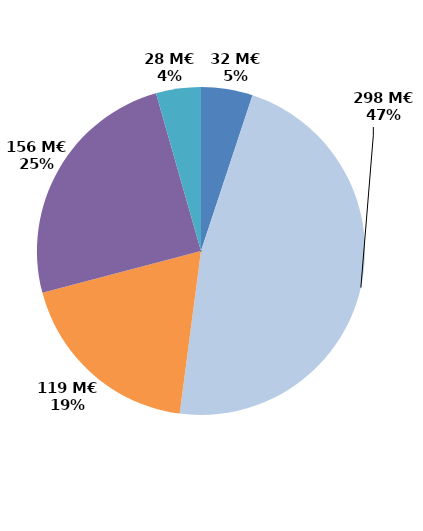
| Category | Series 0 |
|---|---|
| Contrats aidés marchand (hors IAE) | 32.262 |
| Contrats aidés non marchand (hors IAE) | 297.887 |
| Insertion par l'activité économique | 119.312 |
| Mesures en faveur des handicapés | 156.494 |
| Autres emplois aidés | 28.039 |